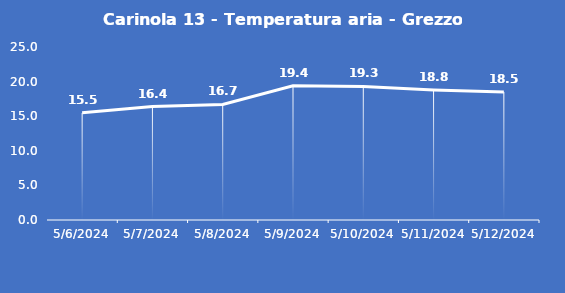
| Category | Carinola 13 - Temperatura aria - Grezzo (°C) |
|---|---|
| 5/6/24 | 15.5 |
| 5/7/24 | 16.4 |
| 5/8/24 | 16.7 |
| 5/9/24 | 19.4 |
| 5/10/24 | 19.3 |
| 5/11/24 | 18.8 |
| 5/12/24 | 18.5 |